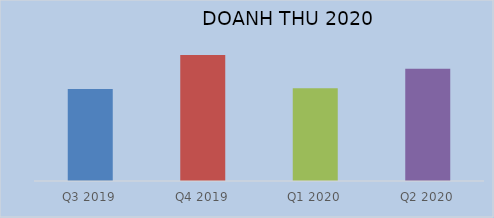
| Category | Series 0 |
|---|---|
| Q3 2019 | 4509383175397 |
| Q4 2019 | 6167760490036 |
| Q1 2020 | 4535516635143 |
| Q2 2020 | 5493639514594 |